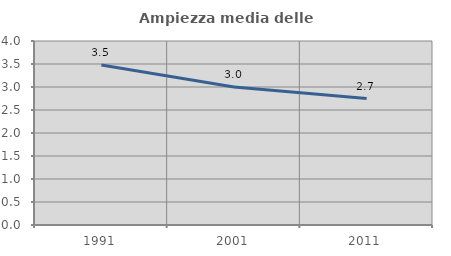
| Category | Ampiezza media delle famiglie |
|---|---|
| 1991.0 | 3.476 |
| 2001.0 | 3.002 |
| 2011.0 | 2.749 |